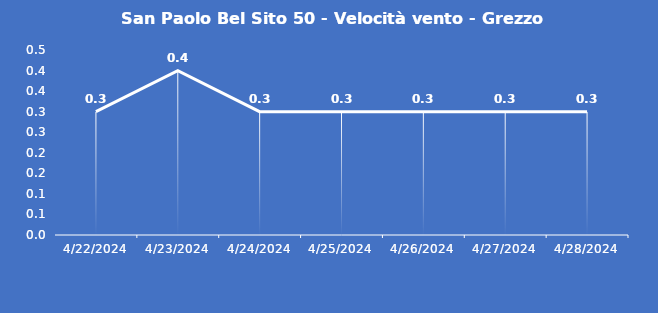
| Category | San Paolo Bel Sito 50 - Velocità vento - Grezzo (m/s) |
|---|---|
| 4/22/24 | 0.3 |
| 4/23/24 | 0.4 |
| 4/24/24 | 0.3 |
| 4/25/24 | 0.3 |
| 4/26/24 | 0.3 |
| 4/27/24 | 0.3 |
| 4/28/24 | 0.3 |